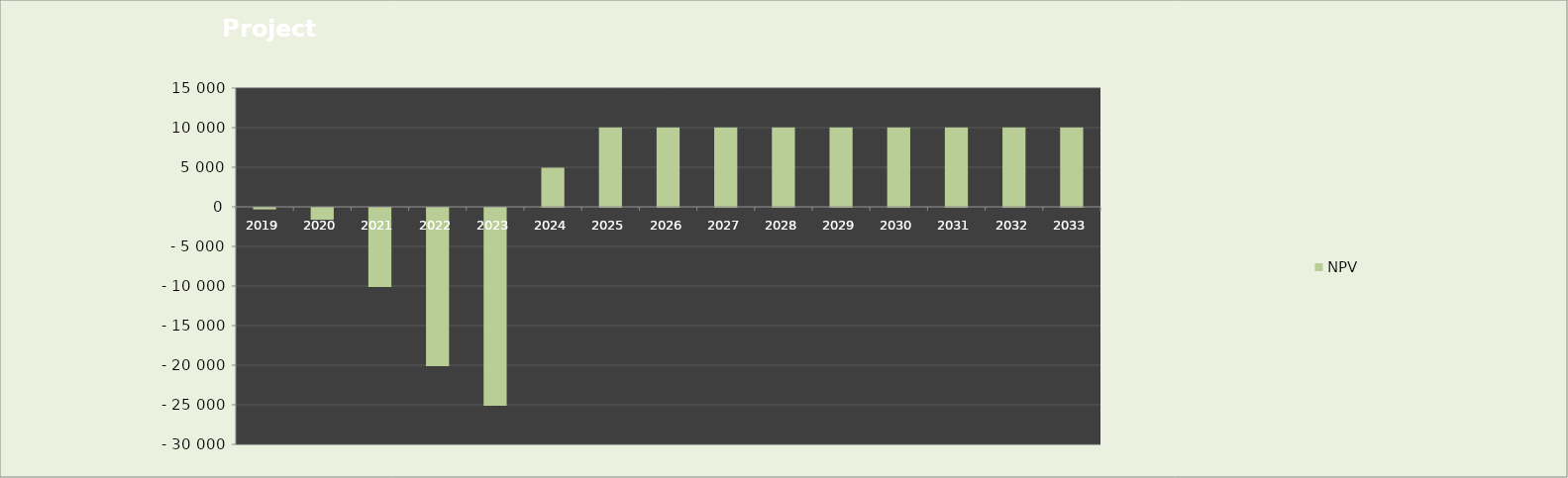
| Category | NPV |
|---|---|
| 2019.0 | -200 |
| 2020.0 | -1500 |
| 2021.0 | -10000 |
| 2022.0 | -20000 |
| 2023.0 | -25000 |
| 2024.0 | 4940 |
| 2025.0 | 10030 |
| 2026.0 | 10030 |
| 2027.0 | 10030 |
| 2028.0 | 10030 |
| 2029.0 | 10030 |
| 2030.0 | 10030 |
| 2031.0 | 10030 |
| 2032.0 | 10030 |
| 2033.0 | 10030 |